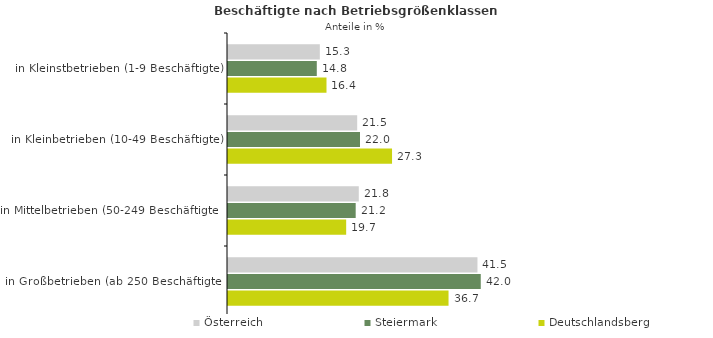
| Category | Österreich | Steiermark | Deutschlandsberg |
|---|---|---|---|
| in Kleinstbetrieben (1-9 Beschäftigte) | 15.273 | 14.768 | 16.381 |
| in Kleinbetrieben (10-49 Beschäftigte) | 21.487 | 21.955 | 27.284 |
| in Mittelbetrieben (50-249 Beschäftigte) | 21.75 | 21.237 | 19.654 |
| in Großbetrieben (ab 250 Beschäftigte) | 41.489 | 42.04 | 36.68 |